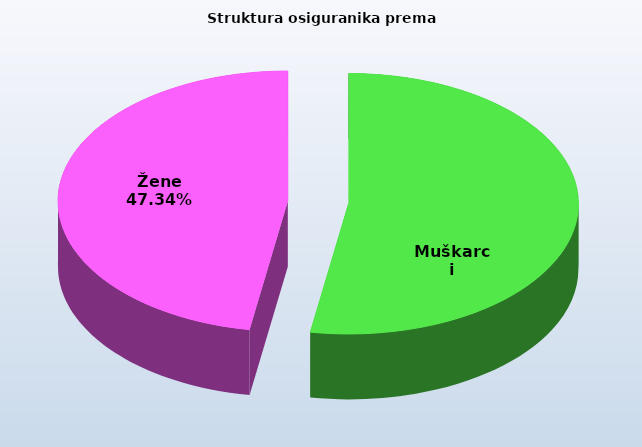
| Category | Series 0 |
|---|---|
| Muškarci | 835001 |
| Žene | 750675 |